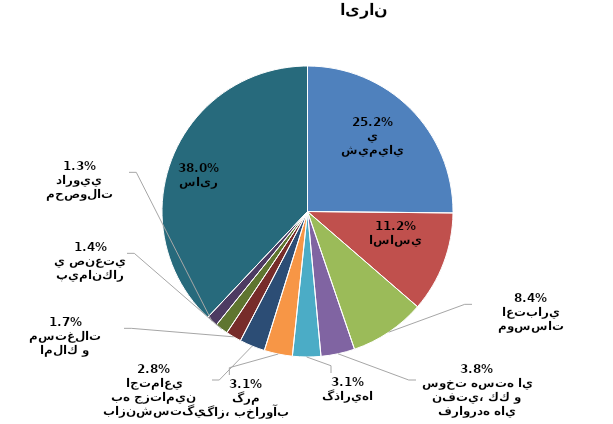
| Category | درصد از كل |
|---|---|
| محصولات شيميايي | 0.252 |
| فلزات اساسي | 0.112 |
| بانكها و موسسات اعتباري | 0.084 |
| فراورده هاي نفتي، كك و سوخت هسته اي | 0.038 |
| سرمايه گذاريها | 0.031 |
| عرضه برق، گاز، بخاروآب گرم | 0.031 |
| بيمه وصندوق بازنشستگي به جزتامين اجتماعي | 0.028 |
| انبوه سازي، املاك و مستغلات | 0.017 |
| پيمانكاري صنعتي | 0.014 |
| مواد و محصولات دارويي | 0.013 |
| سایر | 0.38 |